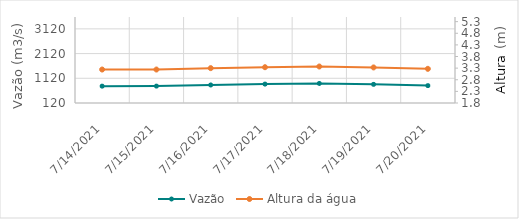
| Category | Vazão |
|---|---|
| 7/7/21 | 1428.19 |
| 7/6/21 | 1502.06 |
| 7/5/21 | 1417.72 |
| 7/4/21 | 1338.11 |
| 7/3/21 | 1294.57 |
| 7/2/21 | 1405.13 |
| 7/1/21 | 1474.39 |